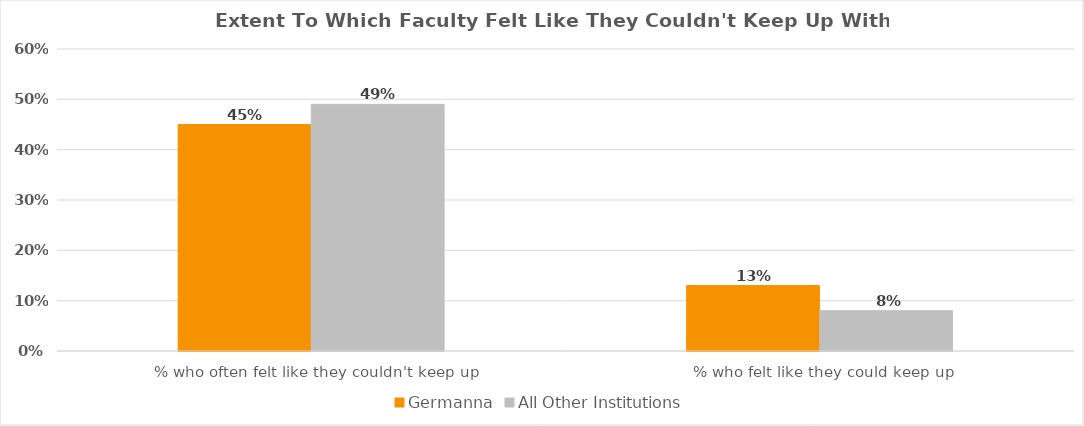
| Category | Germanna | All Other Institutions |
|---|---|---|
| % who often felt like they couldn't keep up
 | 0.45 | 0.49 |
| % who felt like they could keep up
 | 0.13 | 0.08 |